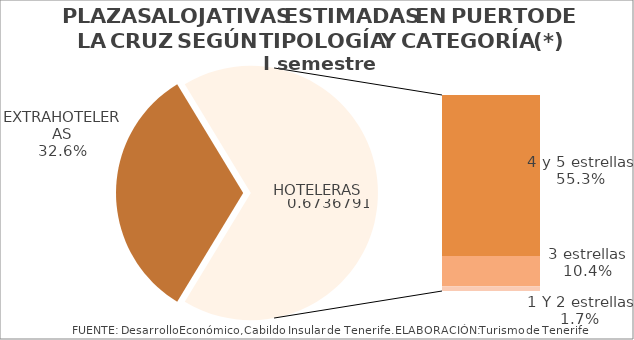
| Category | I semestre 2014 |
|---|---|
| EXTRAHOTELERAS | 0.326 |
| 4 y 5 estrellas | 0.553 |
| 3 estrellas | 0.104 |
| 1 Y 2 estrellas | 0.017 |